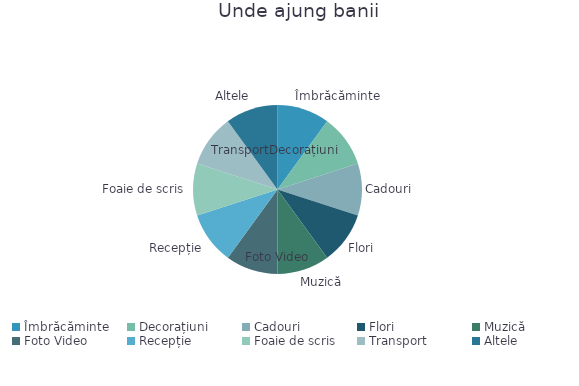
| Category | Sumă |
|---|---|
| Îmbrăcăminte | 1 |
| Decorațiuni | 1 |
| Cadouri | 1 |
| Flori | 1 |
| Muzică | 1 |
| Foto Video | 1 |
| Recepție | 1 |
| Foaie de scris | 1 |
| Transport | 1 |
| Altele | 1 |